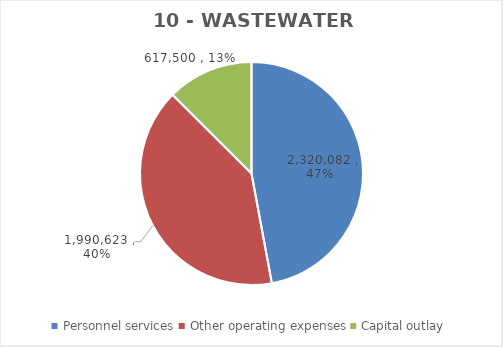
| Category | Series 0 | Series 1 | Series 2 | Series 3 | Series 4 | Series 5 | Series 6 |
|---|---|---|---|---|---|---|---|
| Personnel services | 2320082 |  |  | 2063709 | 2272594 | 2320082 | 2320082 |
| Other operating expenses | 1990622.65 |  |  | 1802903 | 1868135 | 1990622.65 | 1990622.65 |
| Capital outlay | 617500 |  |  | 566399 | 557500 | 617500 | 617500 |